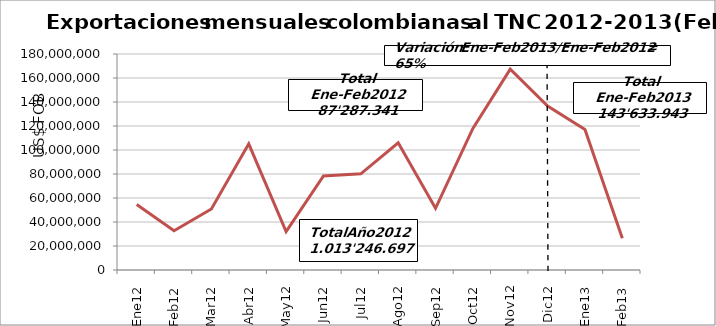
| Category | Series 0 |
|---|---|
| 0 | 54531189 |
| 1 | 32756152 |
| 2 | 50847623 |
| 3 | 105162952 |
| 4 | 32039393 |
| 5 | 78382783 |
| 6 | 80176265 |
| 7 | 105942774 |
| 8 | 51443479 |
| 9 | 117969289 |
| 10 | 167379972 |
| 11 | 136614826 |
| 12 | 117114891.45 |
| 13 | 26519051.43 |